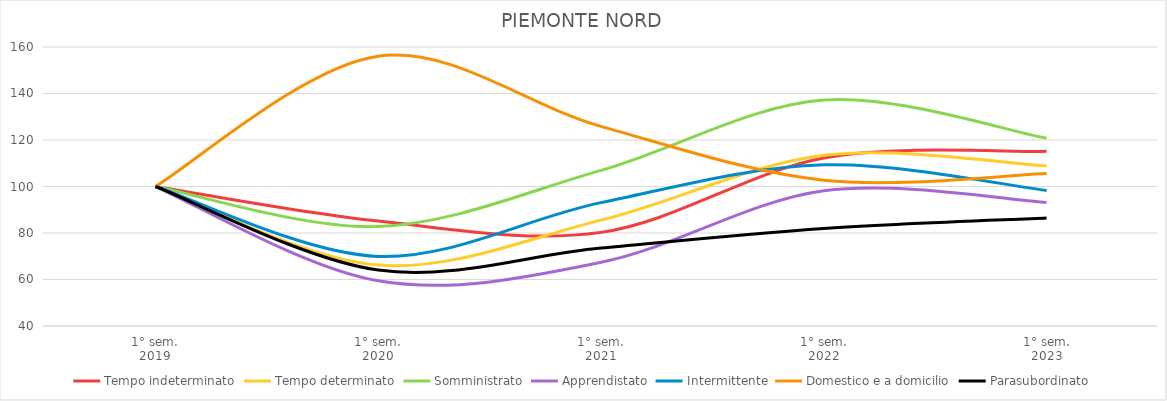
| Category | Tempo indeterminato | Tempo determinato | Somministrato | Apprendistato | Intermittente | Domestico e a domicilio | Parasubordinato |
|---|---|---|---|---|---|---|---|
| 1° sem.
2019 | 100 | 100 | 100 | 100 | 100 | 100 | 100 |
| 1° sem.
2020 | 85.122 | 66.186 | 82.797 | 59.446 | 69.919 | 156.054 | 64.058 |
| 1° sem.
2021 | 80.266 | 85.521 | 106.94 | 67.385 | 93.072 | 125.853 | 73.527 |
| 1° sem.
2022 | 112.259 | 113.395 | 137.182 | 98.154 | 109.321 | 102.712 | 81.981 |
| 1° sem.
2023 | 115.115 | 108.874 | 120.757 | 93.169 | 98.32 | 105.563 | 86.473 |